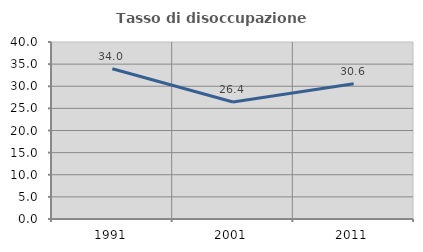
| Category | Tasso di disoccupazione giovanile  |
|---|---|
| 1991.0 | 33.963 |
| 2001.0 | 26.429 |
| 2011.0 | 30.569 |